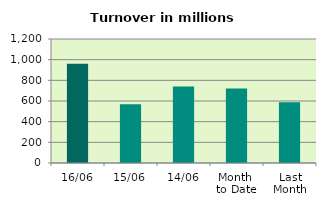
| Category | Series 0 |
|---|---|
| 16/06 | 960.078 |
| 15/06 | 569.442 |
| 14/06 | 739.176 |
| Month 
to Date | 720.274 |
| Last
Month | 587.249 |